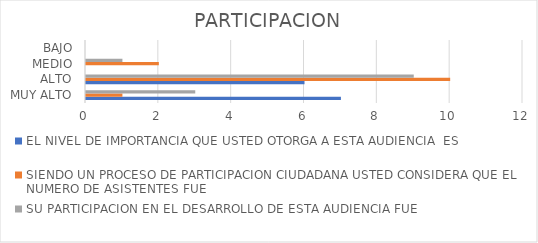
| Category | EL NIVEL DE IMPORTANCIA QUE USTED OTORGA A ESTA AUDIENCIA  ES | SIENDO UN PROCESO DE PARTICIPACION CIUDADANA USTED CONSIDERA QUE EL NUMERO DE ASISTENTES FUE | SU PARTICIPACION EN EL DESARROLLO DE ESTA AUDIENCIA FUE |
|---|---|---|---|
| MUY ALTO | 7 | 1 | 3 |
| ALTO | 6 | 10 | 9 |
| MEDIO | 0 | 2 | 1 |
| BAJO | 0 | 0 | 0 |